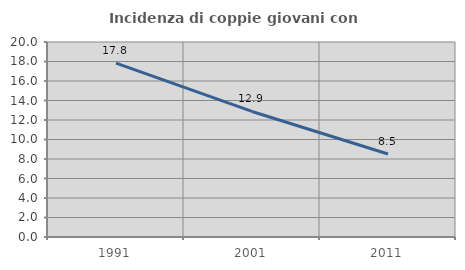
| Category | Incidenza di coppie giovani con figli |
|---|---|
| 1991.0 | 17.84 |
| 2001.0 | 12.876 |
| 2011.0 | 8.516 |